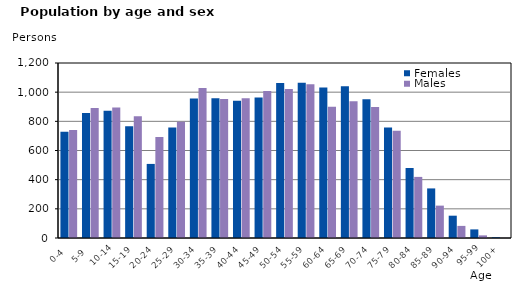
| Category | Females | Males |
|---|---|---|
|   0-4  | 728 | 741 |
|   5-9  | 858 | 891 |
| 10-14 | 872 | 895 |
| 15-19  | 766 | 835 |
| 20-24  | 508 | 692 |
| 25-29  | 758 | 798 |
| 30-34  | 956 | 1028 |
| 35-39  | 958 | 953 |
| 40-44  | 941 | 958 |
| 45-49  | 964 | 1008 |
| 50-54  | 1063 | 1021 |
| 55-59  | 1065 | 1055 |
| 60-64  | 1032 | 900 |
| 65-69  | 1041 | 937 |
| 70-74  | 952 | 898 |
| 75-79  | 757 | 735 |
| 80-84  | 480 | 419 |
| 85-89  | 340 | 222 |
| 90-94  | 153 | 83 |
| 95-99 | 59 | 18 |
| 100+ | 5 | 1 |